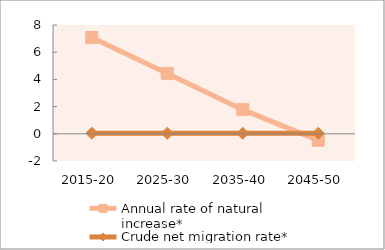
| Category | Annual rate of natural increase* | Crude net migration rate* |
|---|---|---|
| 2015-20 | 7.082 | 0.042 |
| 2025-30 | 4.441 | 0.04 |
| 2035-40 | 1.777 | 0.039 |
| 2045-50 | -0.481 | 0.039 |